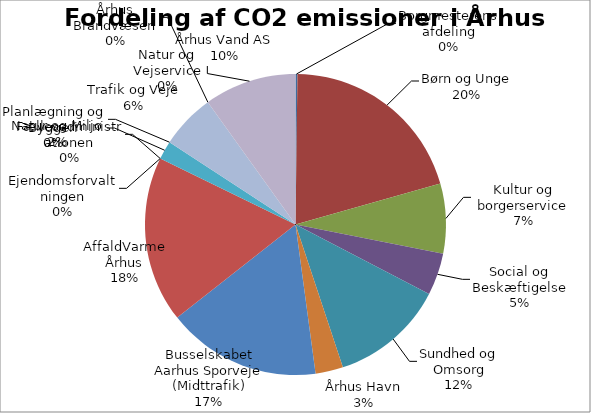
| Category | Series 0 | Series 1 |
|---|---|---|
| Borgmesterens afdeling |  | 219.07 |
| Børn og Unge |  | 21488.727 |
| Kultur og Borgerservice |  | 7890.314 |
| Social og Beskæftigelse |  | 4758.175 |
| Sundhed og Omsorg |  | 12925.643 |
| Århus Havn |  | 3122.408 |
| Busselskabet Aarhus Sporveje (Midttrafik) |  | 17393.148 |
| AffaldVarme Århus |  | 18778.618 |
| Ejendomsforvaltningen |  | 0 |
| Fællesadministrationen |  | 0 |
| Natur og Miljø |  | -2090.261 |
| Planlægning og Byggeri |  | 0 |
| Trafik og Veje |  | 6208.786 |
| Natur og Vejservice |  | 0 |
| Århus Brandvæsen |  | 0.061 |
| Århus Vand AS |  | 10420.878 |